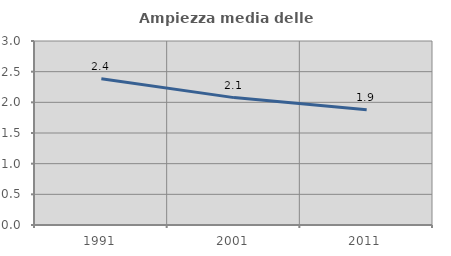
| Category | Ampiezza media delle famiglie |
|---|---|
| 1991.0 | 2.384 |
| 2001.0 | 2.077 |
| 2011.0 | 1.879 |